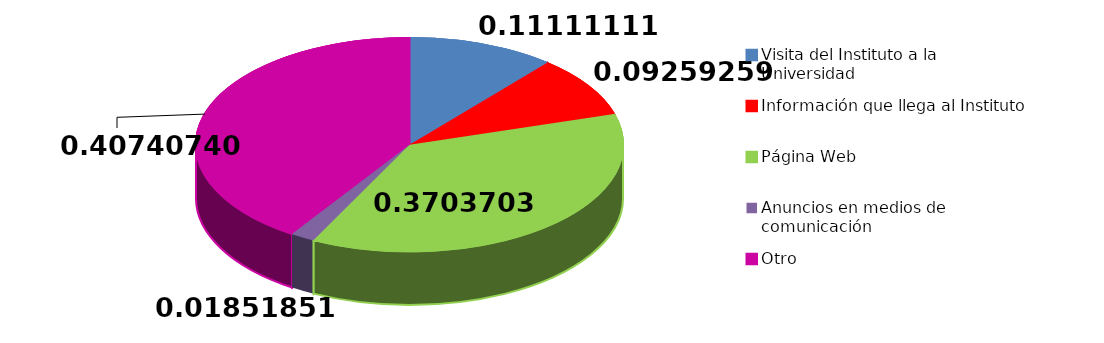
| Category | Sí | No |
|---|---|---|
| Visita del Instituto a la Universidad | 6 | 96 |
| Información que llega al Instituto | 5 | 97 |
| Página Web | 20 | 98 |
| Anuncios en medios de comunicación | 1 | 99 |
| Otro | 22 | 100 |